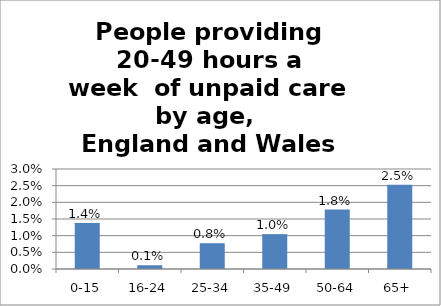
| Category | Series 0 |
|---|---|
| 0-15 | 0.014 |
| 16-24 | 0.001 |
| 25-34 | 0.008 |
| 35-49 | 0.01 |
| 50-64 | 0.018 |
| 65+ | 0.025 |